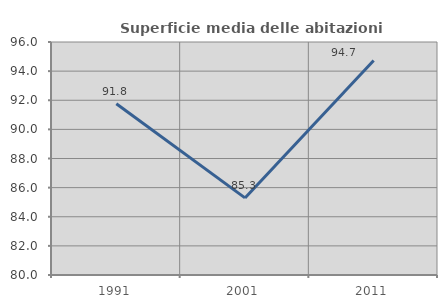
| Category | Superficie media delle abitazioni occupate |
|---|---|
| 1991.0 | 91.755 |
| 2001.0 | 85.294 |
| 2011.0 | 94.725 |